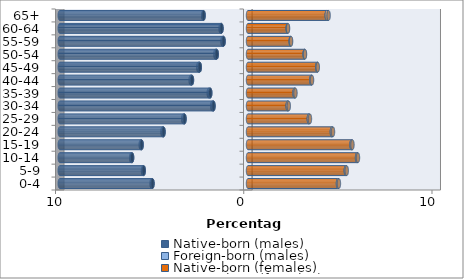
| Category | Native-born (males) | Foreign-born (males) | Native-born (females) | Foreign-born (females) |
|---|---|---|---|---|
| 0-4 | -5.073 | -0.051 | 4.779 | 0.051 |
| 5-9 | -5.539 | -0.041 | 5.194 | 0.051 |
| 10-14 | -6.156 | -0.051 | 5.792 | 0.051 |
| 15-19 | -5.65 | -0.051 | 5.498 | 0.051 |
| 20-24 | -4.486 | -0.061 | 4.455 | 0.061 |
| 25-29 | -3.372 | -0.071 | 3.23 | 0.061 |
| 30-34 | -1.833 | -0.071 | 2.106 | 0.061 |
| 35-39 | -2.005 | -0.081 | 2.471 | 0.051 |
| 40-44 | -2.977 | -0.071 | 3.362 | 0.041 |
| 45-49 | -2.562 | -0.081 | 3.676 | 0.03 |
| 50-54 | -1.661 | -0.071 | 3.007 | 0.02 |
| 55-59 | -1.296 | -0.061 | 2.268 | 0.02 |
| 60-64 | -1.407 | -0.051 | 2.106 | 0.02 |
| 65+ | -2.359 | -0.02 | 4.182 | 0.101 |